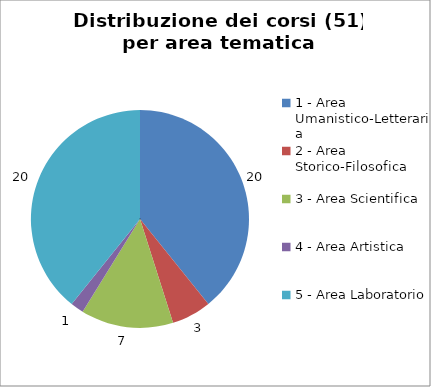
| Category | Nr. Corsi |
|---|---|
| 1 - Area Umanistico-Letteraria | 20 |
| 2 - Area Storico-Filosofica | 3 |
| 3 - Area Scientifica | 7 |
| 4 - Area Artistica | 1 |
| 5 - Area Laboratorio | 20 |